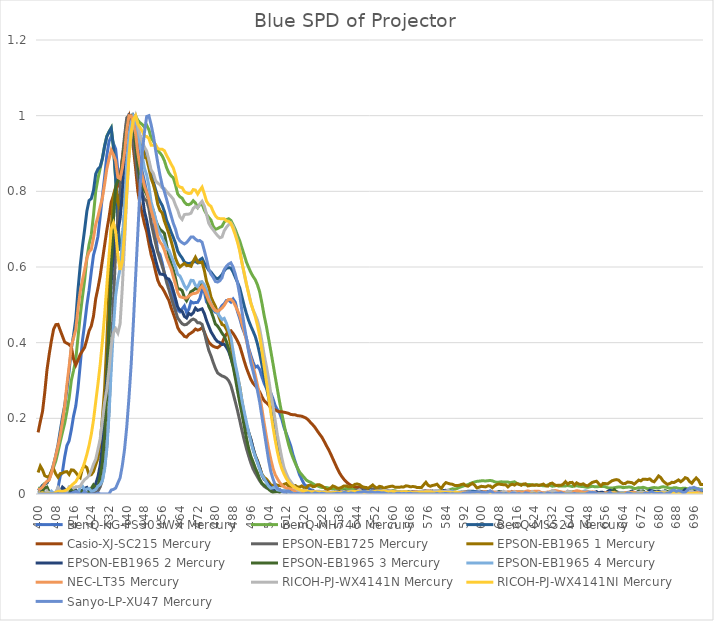
| Category | BenQ-KG-PS303WX | BenQ-MH740 | BenQ-MS524 | Casio-XJ-SC215 | EPSON-EB1725 | EPSON-EB1965 1 | EPSON-EB1965 2 | EPSON-EB1965 3 | EPSON-EB1965 4 | NEC-LT35 | RICOH-PJ-WX4141N | RICOH-PJ-WX4141NI | Sanyo-LP-XU47 |
|---|---|---|---|---|---|---|---|---|---|---|---|---|---|
| 400.0 | 0 | 0.015 | 0.009 | 0.163 | 0 | 0.057 | 0.003 | 0 | 0.005 | 0.011 | 0.004 | 0.003 | 0 |
| 401.0 | 0 | 0.015 | 0.014 | 0.192 | 0 | 0.074 | 0.006 | 0 | 0 | 0.014 | 0 | 0.002 | 0 |
| 402.0 | 0 | 0.022 | 0.023 | 0.218 | 0 | 0.064 | 0.003 | 0.008 | 0 | 0.018 | 0 | 0.003 | 0 |
| 403.0 | 0 | 0.028 | 0.026 | 0.268 | 0 | 0.048 | 0.003 | 0.016 | 0 | 0.027 | 0.001 | 0.001 | 0 |
| 404.0 | 0 | 0.03 | 0.03 | 0.328 | 0 | 0.046 | 0.001 | 0.018 | 0 | 0.034 | 0.008 | 0.002 | 0 |
| 405.0 | 0 | 0.04 | 0.04 | 0.369 | 0 | 0.046 | 0 | 0.006 | 0.002 | 0.037 | 0 | 0.002 | 0 |
| 406.0 | 0 | 0.058 | 0.059 | 0.405 | 0 | 0.06 | 0.004 | 0 | 0.008 | 0.055 | 0 | 0 | 0 |
| 407.0 | 0 | 0.071 | 0.079 | 0.436 | 0 | 0.066 | 0.002 | 0 | 0.001 | 0.078 | 0 | 0.001 | 0 |
| 408.0 | 0 | 0.088 | 0.102 | 0.448 | 0 | 0.053 | 0.002 | 0 | 0.005 | 0.102 | 0.005 | 0.004 | 0 |
| 409.0 | 0.017 | 0.112 | 0.131 | 0.448 | 0.001 | 0.044 | 0 | 0.001 | 0.003 | 0.127 | 0.017 | 0.007 | 0.001 |
| 410.0 | 0.047 | 0.138 | 0.167 | 0.432 | 0.001 | 0.054 | 0.006 | 0.007 | 0 | 0.156 | 0.008 | 0.007 | 0 |
| 411.0 | 0.059 | 0.164 | 0.203 | 0.417 | 0 | 0.055 | 0.018 | 0 | 0 | 0.191 | 0 | 0.007 | 0 |
| 412.0 | 0.098 | 0.187 | 0.234 | 0.402 | 0.001 | 0.058 | 0.013 | 0 | 0 | 0.233 | 0 | 0.008 | 0 |
| 413.0 | 0.128 | 0.218 | 0.277 | 0.399 | 0 | 0.059 | 0 | 0.001 | 0 | 0.289 | 0.007 | 0.011 | 0 |
| 414.0 | 0.141 | 0.254 | 0.326 | 0.395 | 0 | 0.052 | 0.002 | 0.011 | 0 | 0.338 | 0.019 | 0.016 | 0 |
| 415.0 | 0.17 | 0.3 | 0.384 | 0.389 | 0 | 0.064 | 0.012 | 0.012 | 0 | 0.391 | 0.02 | 0.022 | 0 |
| 416.0 | 0.206 | 0.326 | 0.42 | 0.357 | 0 | 0.063 | 0.007 | 0.011 | 0 | 0.412 | 0.015 | 0.028 | 0.005 |
| 417.0 | 0.232 | 0.356 | 0.463 | 0.341 | 0 | 0.057 | 0.011 | 0.008 | 0.002 | 0.435 | 0.019 | 0.033 | 0.007 |
| 418.0 | 0.279 | 0.414 | 0.54 | 0.354 | 0 | 0.049 | 0.004 | 0.003 | 0 | 0.49 | 0.019 | 0.043 | 0.004 |
| 419.0 | 0.341 | 0.472 | 0.603 | 0.369 | 0 | 0.043 | 0 | 0.009 | 0.019 | 0.535 | 0.02 | 0.056 | 0 |
| 420.0 | 0.405 | 0.52 | 0.654 | 0.378 | 0 | 0.067 | 0.01 | 0.006 | 0.021 | 0.565 | 0.03 | 0.067 | 0 |
| 421.0 | 0.449 | 0.566 | 0.699 | 0.388 | 0 | 0.075 | 0.015 | 0.003 | 0.011 | 0.593 | 0.038 | 0.084 | 0.007 |
| 422.0 | 0.499 | 0.622 | 0.747 | 0.408 | 0 | 0.07 | 0.017 | 0.003 | 0.013 | 0.624 | 0.042 | 0.105 | 0 |
| 423.0 | 0.539 | 0.659 | 0.776 | 0.431 | 0.001 | 0.049 | 0.008 | 0.002 | 0.015 | 0.64 | 0.049 | 0.128 | 0 |
| 424.0 | 0.588 | 0.685 | 0.781 | 0.444 | 0.001 | 0.051 | 0.009 | 0.015 | 0.007 | 0.646 | 0.062 | 0.158 | 0 |
| 425.0 | 0.632 | 0.738 | 0.802 | 0.47 | 0.003 | 0.059 | 0.015 | 0.024 | 0.009 | 0.677 | 0.079 | 0.195 | 0 |
| 426.0 | 0.653 | 0.801 | 0.846 | 0.516 | 0.004 | 0.077 | 0.027 | 0.017 | 0.012 | 0.713 | 0.092 | 0.244 | 0 |
| 427.0 | 0.681 | 0.833 | 0.859 | 0.544 | 0.008 | 0.094 | 0.045 | 0.019 | 0.02 | 0.733 | 0.118 | 0.291 | 0.002 |
| 428.0 | 0.733 | 0.861 | 0.865 | 0.576 | 0.018 | 0.134 | 0.075 | 0.047 | 0.025 | 0.759 | 0.145 | 0.342 | 0 |
| 429.0 | 0.787 | 0.887 | 0.886 | 0.617 | 0.037 | 0.201 | 0.127 | 0.082 | 0.035 | 0.782 | 0.193 | 0.403 | 0 |
| 430.0 | 0.837 | 0.92 | 0.919 | 0.657 | 0.071 | 0.277 | 0.197 | 0.15 | 0.064 | 0.818 | 0.241 | 0.472 | 0 |
| 431.0 | 0.895 | 0.946 | 0.945 | 0.697 | 0.127 | 0.402 | 0.31 | 0.268 | 0.118 | 0.859 | 0.276 | 0.55 | 0 |
| 432.0 | 0.932 | 0.958 | 0.957 | 0.731 | 0.221 | 0.546 | 0.438 | 0.425 | 0.208 | 0.886 | 0.33 | 0.629 | 0 |
| 433.0 | 0.945 | 0.968 | 0.967 | 0.771 | 0.362 | 0.698 | 0.561 | 0.6 | 0.329 | 0.909 | 0.393 | 0.701 | 0.01 |
| 434.0 | 0.926 | 0.914 | 0.919 | 0.789 | 0.509 | 0.789 | 0.636 | 0.726 | 0.44 | 0.897 | 0.426 | 0.716 | 0.012 |
| 435.0 | 0.912 | 0.832 | 0.833 | 0.808 | 0.642 | 0.812 | 0.688 | 0.812 | 0.524 | 0.881 | 0.437 | 0.694 | 0.016 |
| 436.0 | 0.854 | 0.715 | 0.709 | 0.814 | 0.734 | 0.772 | 0.695 | 0.829 | 0.565 | 0.837 | 0.425 | 0.63 | 0.029 |
| 437.0 | 0.835 | 0.65 | 0.643 | 0.834 | 0.809 | 0.751 | 0.728 | 0.836 | 0.595 | 0.833 | 0.45 | 0.592 | 0.043 |
| 438.0 | 0.883 | 0.665 | 0.667 | 0.883 | 0.887 | 0.779 | 0.797 | 0.872 | 0.667 | 0.862 | 0.546 | 0.617 | 0.075 |
| 439.0 | 0.918 | 0.729 | 0.742 | 0.934 | 0.945 | 0.845 | 0.87 | 0.918 | 0.766 | 0.902 | 0.664 | 0.69 | 0.117 |
| 440.0 | 0.968 | 0.819 | 0.843 | 0.987 | 0.994 | 0.925 | 0.952 | 0.966 | 0.875 | 0.963 | 0.788 | 0.795 | 0.177 |
| 441.0 | 0.995 | 0.903 | 0.928 | 1 | 1 | 0.98 | 1 | 0.997 | 0.949 | 1 | 0.892 | 0.891 | 0.254 |
| 442.0 | 1 | 0.964 | 0.98 | 0.965 | 0.967 | 0.999 | 0.995 | 1 | 0.983 | 1 | 0.953 | 0.956 | 0.343 |
| 443.0 | 0.993 | 0.99 | 1 | 0.914 | 0.927 | 1 | 0.964 | 0.969 | 1 | 0.979 | 0.983 | 0.99 | 0.454 |
| 444.0 | 0.962 | 1 | 0.99 | 0.861 | 0.886 | 0.987 | 0.925 | 0.926 | 0.993 | 0.952 | 1 | 1 | 0.573 |
| 445.0 | 0.919 | 0.988 | 0.961 | 0.801 | 0.837 | 0.955 | 0.876 | 0.873 | 0.952 | 0.902 | 0.976 | 0.979 | 0.69 |
| 446.0 | 0.88 | 0.981 | 0.945 | 0.766 | 0.812 | 0.946 | 0.832 | 0.835 | 0.923 | 0.866 | 0.949 | 0.969 | 0.808 |
| 447.0 | 0.851 | 0.977 | 0.923 | 0.74 | 0.795 | 0.927 | 0.792 | 0.819 | 0.894 | 0.84 | 0.931 | 0.96 | 0.902 |
| 448.0 | 0.826 | 0.969 | 0.905 | 0.714 | 0.779 | 0.89 | 0.746 | 0.803 | 0.861 | 0.814 | 0.917 | 0.946 | 0.956 |
| 449.0 | 0.798 | 0.975 | 0.899 | 0.693 | 0.775 | 0.887 | 0.723 | 0.791 | 0.843 | 0.797 | 0.906 | 0.945 | 0.998 |
| 450.0 | 0.78 | 0.963 | 0.877 | 0.662 | 0.754 | 0.861 | 0.691 | 0.778 | 0.814 | 0.778 | 0.883 | 0.94 | 1 |
| 451.0 | 0.757 | 0.941 | 0.847 | 0.633 | 0.717 | 0.834 | 0.661 | 0.764 | 0.772 | 0.75 | 0.857 | 0.922 | 0.976 |
| 452.0 | 0.734 | 0.933 | 0.825 | 0.614 | 0.69 | 0.818 | 0.644 | 0.749 | 0.75 | 0.73 | 0.848 | 0.922 | 0.947 |
| 453.0 | 0.683 | 0.921 | 0.805 | 0.588 | 0.663 | 0.796 | 0.618 | 0.724 | 0.729 | 0.708 | 0.828 | 0.924 | 0.91 |
| 454.0 | 0.641 | 0.908 | 0.786 | 0.565 | 0.638 | 0.765 | 0.597 | 0.71 | 0.703 | 0.68 | 0.822 | 0.913 | 0.875 |
| 455.0 | 0.633 | 0.902 | 0.773 | 0.552 | 0.62 | 0.749 | 0.581 | 0.7 | 0.687 | 0.666 | 0.818 | 0.911 | 0.843 |
| 456.0 | 0.611 | 0.894 | 0.763 | 0.545 | 0.602 | 0.743 | 0.581 | 0.695 | 0.677 | 0.658 | 0.809 | 0.911 | 0.816 |
| 457.0 | 0.583 | 0.881 | 0.746 | 0.535 | 0.584 | 0.721 | 0.579 | 0.689 | 0.665 | 0.644 | 0.807 | 0.907 | 0.799 |
| 458.0 | 0.566 | 0.862 | 0.723 | 0.523 | 0.559 | 0.705 | 0.57 | 0.657 | 0.649 | 0.625 | 0.799 | 0.895 | 0.779 |
| 459.0 | 0.557 | 0.849 | 0.709 | 0.512 | 0.541 | 0.688 | 0.568 | 0.632 | 0.645 | 0.61 | 0.793 | 0.884 | 0.756 |
| 460.0 | 0.547 | 0.841 | 0.693 | 0.493 | 0.52 | 0.669 | 0.557 | 0.609 | 0.63 | 0.596 | 0.787 | 0.872 | 0.736 |
| 461.0 | 0.52 | 0.836 | 0.678 | 0.477 | 0.501 | 0.648 | 0.538 | 0.593 | 0.615 | 0.574 | 0.779 | 0.862 | 0.716 |
| 462.0 | 0.487 | 0.817 | 0.663 | 0.46 | 0.483 | 0.624 | 0.516 | 0.57 | 0.599 | 0.554 | 0.764 | 0.843 | 0.7 |
| 463.0 | 0.486 | 0.793 | 0.642 | 0.44 | 0.465 | 0.609 | 0.494 | 0.542 | 0.581 | 0.532 | 0.75 | 0.816 | 0.678 |
| 464.0 | 0.482 | 0.785 | 0.632 | 0.43 | 0.457 | 0.6 | 0.486 | 0.542 | 0.576 | 0.521 | 0.733 | 0.811 | 0.669 |
| 465.0 | 0.489 | 0.782 | 0.624 | 0.424 | 0.45 | 0.605 | 0.483 | 0.538 | 0.564 | 0.52 | 0.726 | 0.81 | 0.664 |
| 466.0 | 0.497 | 0.772 | 0.613 | 0.417 | 0.447 | 0.609 | 0.47 | 0.52 | 0.551 | 0.518 | 0.738 | 0.799 | 0.661 |
| 467.0 | 0.48 | 0.765 | 0.61 | 0.415 | 0.448 | 0.604 | 0.465 | 0.511 | 0.542 | 0.518 | 0.74 | 0.796 | 0.665 |
| 468.0 | 0.488 | 0.765 | 0.609 | 0.422 | 0.453 | 0.604 | 0.477 | 0.523 | 0.551 | 0.523 | 0.74 | 0.794 | 0.672 |
| 469.0 | 0.508 | 0.768 | 0.61 | 0.425 | 0.46 | 0.602 | 0.473 | 0.535 | 0.565 | 0.527 | 0.742 | 0.795 | 0.679 |
| 470.0 | 0.505 | 0.775 | 0.614 | 0.43 | 0.462 | 0.615 | 0.479 | 0.538 | 0.564 | 0.53 | 0.755 | 0.805 | 0.679 |
| 471.0 | 0.506 | 0.769 | 0.614 | 0.436 | 0.459 | 0.626 | 0.491 | 0.544 | 0.552 | 0.53 | 0.76 | 0.803 | 0.674 |
| 472.0 | 0.507 | 0.757 | 0.611 | 0.433 | 0.453 | 0.613 | 0.485 | 0.541 | 0.548 | 0.533 | 0.756 | 0.793 | 0.669 |
| 473.0 | 0.517 | 0.764 | 0.619 | 0.435 | 0.452 | 0.611 | 0.487 | 0.546 | 0.561 | 0.543 | 0.767 | 0.803 | 0.67 |
| 474.0 | 0.54 | 0.767 | 0.623 | 0.44 | 0.448 | 0.613 | 0.489 | 0.557 | 0.561 | 0.55 | 0.774 | 0.811 | 0.665 |
| 475.0 | 0.535 | 0.751 | 0.611 | 0.428 | 0.427 | 0.591 | 0.477 | 0.547 | 0.553 | 0.54 | 0.761 | 0.793 | 0.644 |
| 476.0 | 0.508 | 0.739 | 0.601 | 0.413 | 0.402 | 0.562 | 0.459 | 0.526 | 0.54 | 0.526 | 0.74 | 0.774 | 0.621 |
| 477.0 | 0.5 | 0.731 | 0.591 | 0.402 | 0.38 | 0.546 | 0.444 | 0.496 | 0.518 | 0.512 | 0.716 | 0.765 | 0.595 |
| 478.0 | 0.497 | 0.724 | 0.587 | 0.395 | 0.365 | 0.521 | 0.429 | 0.484 | 0.503 | 0.501 | 0.706 | 0.76 | 0.581 |
| 479.0 | 0.487 | 0.708 | 0.579 | 0.391 | 0.348 | 0.508 | 0.419 | 0.467 | 0.492 | 0.492 | 0.698 | 0.747 | 0.573 |
| 480.0 | 0.481 | 0.7 | 0.571 | 0.388 | 0.332 | 0.496 | 0.409 | 0.449 | 0.484 | 0.485 | 0.69 | 0.736 | 0.562 |
| 481.0 | 0.479 | 0.702 | 0.569 | 0.387 | 0.32 | 0.478 | 0.403 | 0.444 | 0.479 | 0.483 | 0.683 | 0.729 | 0.56 |
| 482.0 | 0.488 | 0.705 | 0.573 | 0.391 | 0.316 | 0.462 | 0.4 | 0.435 | 0.469 | 0.487 | 0.677 | 0.728 | 0.564 |
| 483.0 | 0.498 | 0.707 | 0.58 | 0.398 | 0.312 | 0.448 | 0.395 | 0.425 | 0.461 | 0.492 | 0.679 | 0.727 | 0.572 |
| 484.0 | 0.503 | 0.719 | 0.59 | 0.413 | 0.31 | 0.446 | 0.396 | 0.418 | 0.464 | 0.499 | 0.696 | 0.727 | 0.593 |
| 485.0 | 0.512 | 0.725 | 0.596 | 0.423 | 0.306 | 0.435 | 0.388 | 0.402 | 0.451 | 0.509 | 0.705 | 0.722 | 0.602 |
| 486.0 | 0.512 | 0.728 | 0.598 | 0.429 | 0.3 | 0.42 | 0.377 | 0.384 | 0.433 | 0.514 | 0.712 | 0.721 | 0.608 |
| 487.0 | 0.507 | 0.723 | 0.597 | 0.432 | 0.287 | 0.392 | 0.359 | 0.361 | 0.414 | 0.514 | 0.717 | 0.715 | 0.611 |
| 488.0 | 0.515 | 0.712 | 0.587 | 0.424 | 0.266 | 0.363 | 0.34 | 0.336 | 0.378 | 0.509 | 0.708 | 0.701 | 0.6 |
| 489.0 | 0.507 | 0.699 | 0.573 | 0.415 | 0.243 | 0.335 | 0.32 | 0.307 | 0.343 | 0.497 | 0.689 | 0.684 | 0.581 |
| 490.0 | 0.481 | 0.683 | 0.559 | 0.404 | 0.22 | 0.309 | 0.296 | 0.273 | 0.315 | 0.485 | 0.669 | 0.665 | 0.557 |
| 491.0 | 0.464 | 0.669 | 0.545 | 0.391 | 0.194 | 0.284 | 0.271 | 0.241 | 0.283 | 0.471 | 0.646 | 0.642 | 0.525 |
| 492.0 | 0.442 | 0.65 | 0.521 | 0.372 | 0.168 | 0.245 | 0.239 | 0.212 | 0.247 | 0.45 | 0.612 | 0.611 | 0.483 |
| 493.0 | 0.427 | 0.632 | 0.498 | 0.352 | 0.143 | 0.212 | 0.211 | 0.18 | 0.218 | 0.43 | 0.582 | 0.585 | 0.446 |
| 494.0 | 0.412 | 0.613 | 0.477 | 0.333 | 0.121 | 0.183 | 0.181 | 0.149 | 0.19 | 0.406 | 0.554 | 0.556 | 0.412 |
| 495.0 | 0.385 | 0.599 | 0.459 | 0.318 | 0.101 | 0.163 | 0.163 | 0.121 | 0.165 | 0.38 | 0.532 | 0.528 | 0.376 |
| 496.0 | 0.367 | 0.586 | 0.444 | 0.303 | 0.082 | 0.144 | 0.145 | 0.099 | 0.138 | 0.358 | 0.506 | 0.504 | 0.347 |
| 497.0 | 0.348 | 0.575 | 0.43 | 0.293 | 0.066 | 0.12 | 0.122 | 0.085 | 0.116 | 0.338 | 0.487 | 0.487 | 0.325 |
| 498.0 | 0.335 | 0.566 | 0.416 | 0.286 | 0.055 | 0.102 | 0.101 | 0.069 | 0.099 | 0.314 | 0.474 | 0.469 | 0.301 |
| 499.0 | 0.338 | 0.553 | 0.396 | 0.279 | 0.045 | 0.088 | 0.086 | 0.056 | 0.082 | 0.288 | 0.459 | 0.446 | 0.273 |
| 500.0 | 0.329 | 0.534 | 0.371 | 0.27 | 0.035 | 0.071 | 0.07 | 0.039 | 0.065 | 0.26 | 0.436 | 0.417 | 0.243 |
| 501.0 | 0.31 | 0.505 | 0.341 | 0.257 | 0.026 | 0.052 | 0.05 | 0.028 | 0.051 | 0.225 | 0.404 | 0.378 | 0.204 |
| 502.0 | 0.293 | 0.472 | 0.312 | 0.247 | 0.02 | 0.044 | 0.039 | 0.023 | 0.041 | 0.188 | 0.368 | 0.337 | 0.166 |
| 503.0 | 0.28 | 0.444 | 0.284 | 0.241 | 0.016 | 0.04 | 0.034 | 0.018 | 0.031 | 0.153 | 0.339 | 0.299 | 0.128 |
| 504.0 | 0.272 | 0.411 | 0.255 | 0.235 | 0.014 | 0.032 | 0.025 | 0.013 | 0.021 | 0.119 | 0.305 | 0.257 | 0.09 |
| 505.0 | 0.267 | 0.378 | 0.224 | 0.229 | 0.012 | 0.024 | 0.018 | 0.008 | 0.015 | 0.092 | 0.266 | 0.216 | 0.06 |
| 506.0 | 0.251 | 0.344 | 0.192 | 0.225 | 0.009 | 0.023 | 0.014 | 0.004 | 0.016 | 0.068 | 0.232 | 0.178 | 0.04 |
| 507.0 | 0.233 | 0.31 | 0.16 | 0.222 | 0.008 | 0.026 | 0.012 | 0.006 | 0.018 | 0.051 | 0.194 | 0.142 | 0.024 |
| 508.0 | 0.223 | 0.276 | 0.13 | 0.219 | 0.007 | 0.023 | 0.013 | 0.007 | 0.011 | 0.04 | 0.155 | 0.111 | 0.015 |
| 509.0 | 0.213 | 0.242 | 0.103 | 0.217 | 0.007 | 0.022 | 0.011 | 0.004 | 0.01 | 0.03 | 0.125 | 0.085 | 0.012 |
| 510.0 | 0.197 | 0.212 | 0.08 | 0.217 | 0.007 | 0.022 | 0.006 | 0.008 | 0.009 | 0.024 | 0.095 | 0.067 | 0.007 |
| 511.0 | 0.176 | 0.183 | 0.061 | 0.216 | 0.006 | 0.026 | 0.006 | 0.008 | 0.01 | 0.019 | 0.069 | 0.053 | 0.005 |
| 512.0 | 0.16 | 0.155 | 0.047 | 0.215 | 0.007 | 0.028 | 0.005 | 0.007 | 0.011 | 0.016 | 0.054 | 0.041 | 0.007 |
| 513.0 | 0.144 | 0.132 | 0.035 | 0.213 | 0.007 | 0.021 | 0.004 | 0.009 | 0.004 | 0.014 | 0.041 | 0.032 | 0.008 |
| 514.0 | 0.127 | 0.112 | 0.029 | 0.21 | 0.006 | 0.019 | 0.006 | 0.008 | 0.002 | 0.013 | 0.033 | 0.025 | 0.004 |
| 515.0 | 0.104 | 0.096 | 0.023 | 0.21 | 0.006 | 0.022 | 0.006 | 0.002 | 0.005 | 0.011 | 0.024 | 0.02 | 0 |
| 516.0 | 0.086 | 0.082 | 0.017 | 0.209 | 0.006 | 0.023 | 0.005 | 0.001 | 0.004 | 0.008 | 0.017 | 0.017 | 0 |
| 517.0 | 0.069 | 0.069 | 0.014 | 0.207 | 0.006 | 0.019 | 0.004 | 0.004 | 0.005 | 0.008 | 0.011 | 0.014 | 0.002 |
| 518.0 | 0.051 | 0.058 | 0.01 | 0.206 | 0.005 | 0.018 | 0.004 | 0.003 | 0.002 | 0.007 | 0.007 | 0.012 | 0 |
| 519.0 | 0.039 | 0.051 | 0.009 | 0.206 | 0.005 | 0.021 | 0.005 | 0.001 | 0 | 0.006 | 0.009 | 0.009 | 0 |
| 520.0 | 0.026 | 0.044 | 0.007 | 0.203 | 0.006 | 0.017 | 0.004 | 0.001 | 0.002 | 0.007 | 0.01 | 0.008 | 0 |
| 521.0 | 0.021 | 0.037 | 0.004 | 0.2 | 0.007 | 0.016 | 0.003 | 0.003 | 0.005 | 0.006 | 0.007 | 0.008 | 0.002 |
| 522.0 | 0.015 | 0.033 | 0.004 | 0.195 | 0.006 | 0.023 | 0.006 | 0.002 | 0.004 | 0.006 | 0.006 | 0.007 | 0.003 |
| 523.0 | 0.011 | 0.031 | 0.004 | 0.189 | 0.006 | 0.023 | 0.008 | 0.006 | 0.002 | 0.007 | 0.007 | 0.005 | 0 |
| 524.0 | 0.01 | 0.027 | 0.003 | 0.183 | 0.005 | 0.02 | 0.004 | 0.007 | 0.003 | 0.007 | 0.005 | 0.005 | 0 |
| 525.0 | 0.005 | 0.024 | 0.003 | 0.176 | 0.005 | 0.02 | 0.003 | 0.001 | 0.003 | 0.005 | 0.006 | 0.006 | 0.003 |
| 526.0 | 0.001 | 0.022 | 0.002 | 0.167 | 0.005 | 0.025 | 0.004 | 0.002 | 0.002 | 0.004 | 0.007 | 0.005 | 0.001 |
| 527.0 | 0 | 0.019 | 0.002 | 0.158 | 0.004 | 0.024 | 0.004 | 0.002 | 0.002 | 0.004 | 0.007 | 0.004 | 0.001 |
| 528.0 | 0 | 0.017 | 0.001 | 0.151 | 0.003 | 0.021 | 0.003 | 0 | 0.005 | 0.004 | 0.005 | 0.005 | 0.002 |
| 529.0 | 0 | 0.017 | 0.001 | 0.14 | 0.004 | 0.018 | 0.001 | 0.003 | 0.003 | 0.004 | 0.007 | 0.005 | 0.001 |
| 530.0 | 0 | 0.017 | 0.001 | 0.129 | 0.004 | 0.012 | 0 | 0.003 | 0 | 0.005 | 0.005 | 0.004 | 0 |
| 531.0 | 0 | 0.016 | 0.001 | 0.118 | 0.004 | 0.012 | 0 | 0 | 0.001 | 0.005 | 0 | 0.003 | 0 |
| 532.0 | 0 | 0.015 | 0.001 | 0.106 | 0.004 | 0.016 | 0 | 0.003 | 0.003 | 0.004 | 0.002 | 0.003 | 0 |
| 533.0 | 0 | 0.014 | 0.002 | 0.093 | 0.004 | 0.021 | 0.003 | 0.004 | 0.003 | 0.004 | 0.005 | 0.004 | 0 |
| 534.0 | 0 | 0.014 | 0.001 | 0.08 | 0.005 | 0.019 | 0.002 | 0.003 | 0 | 0.003 | 0.004 | 0.004 | 0.001 |
| 535.0 | 0 | 0.015 | 0.002 | 0.068 | 0.006 | 0.015 | 0 | 0.004 | 0.001 | 0.003 | 0.003 | 0.004 | 0.002 |
| 536.0 | 0 | 0.014 | 0.002 | 0.056 | 0.005 | 0.016 | 0 | 0.006 | 0.003 | 0.005 | 0 | 0.003 | 0.001 |
| 537.0 | 0 | 0.013 | 0.002 | 0.047 | 0.006 | 0.018 | 0.001 | 0.005 | 0.006 | 0.005 | 0.003 | 0.003 | 0.001 |
| 538.0 | 0 | 0.014 | 0.002 | 0.039 | 0.007 | 0.021 | 0.007 | 0.002 | 0.005 | 0.003 | 0.006 | 0.004 | 0.004 |
| 539.0 | 0 | 0.015 | 0.003 | 0.033 | 0.005 | 0.021 | 0.007 | 0.003 | 0.001 | 0.003 | 0.005 | 0.005 | 0.003 |
| 540.0 | 0 | 0.015 | 0.004 | 0.027 | 0.006 | 0.019 | 0.002 | 0.001 | 0 | 0.005 | 0.006 | 0.004 | 0.001 |
| 541.0 | 0 | 0.013 | 0.001 | 0.024 | 0.007 | 0.019 | 0.003 | 0.003 | 0.003 | 0.004 | 0.007 | 0.005 | 0.003 |
| 542.0 | 0 | 0.012 | 0 | 0.021 | 0.006 | 0.021 | 0.004 | 0.007 | 0.005 | 0.003 | 0.007 | 0.007 | 0.002 |
| 543.0 | 0 | 0.014 | 0.002 | 0.018 | 0.007 | 0.026 | 0.006 | 0.005 | 0.004 | 0.003 | 0.004 | 0.007 | 0 |
| 544.0 | 0 | 0.014 | 0.002 | 0.018 | 0.01 | 0.026 | 0.004 | 0.006 | 0.004 | 0.003 | 0.007 | 0.007 | 0.004 |
| 545.0 | 0 | 0.012 | 0.001 | 0.018 | 0.012 | 0.025 | 0.005 | 0.007 | 0.004 | 0.003 | 0.011 | 0.006 | 0.005 |
| 546.0 | 0 | 0.011 | 0.001 | 0.017 | 0.011 | 0.02 | 0.008 | 0.001 | 0.001 | 0.004 | 0.007 | 0.005 | 0.005 |
| 547.0 | 0 | 0.009 | 0 | 0.016 | 0.012 | 0.018 | 0.007 | 0.003 | 0.001 | 0.004 | 0.006 | 0.005 | 0.007 |
| 548.0 | 0 | 0.009 | 0 | 0.015 | 0.013 | 0.017 | 0.005 | 0.004 | 0.001 | 0.005 | 0.007 | 0.005 | 0.006 |
| 549.0 | 0 | 0.01 | 0.001 | 0.013 | 0.013 | 0.015 | 0.005 | 0.004 | 0.004 | 0.006 | 0.005 | 0.006 | 0.004 |
| 550.0 | 0 | 0.01 | 0.002 | 0.012 | 0.014 | 0.02 | 0.01 | 0.006 | 0.009 | 0.006 | 0.006 | 0.006 | 0.006 |
| 551.0 | 0 | 0.01 | 0.001 | 0.012 | 0.014 | 0.024 | 0.008 | 0.004 | 0.006 | 0.004 | 0.008 | 0.006 | 0.005 |
| 552.0 | 0 | 0.011 | 0.003 | 0.011 | 0.014 | 0.019 | 0.004 | 0.002 | 0.005 | 0.004 | 0.007 | 0.007 | 0.003 |
| 553.0 | 0 | 0.01 | 0.002 | 0.009 | 0.013 | 0.016 | 0.004 | 0.005 | 0.006 | 0.005 | 0.008 | 0.007 | 0.005 |
| 554.0 | 0 | 0.01 | 0.001 | 0.008 | 0.012 | 0.02 | 0.005 | 0.004 | 0.004 | 0.005 | 0.008 | 0.007 | 0.004 |
| 555.0 | 0 | 0.011 | 0.001 | 0.007 | 0.011 | 0.019 | 0.006 | 0.002 | 0.003 | 0.005 | 0.008 | 0.007 | 0.003 |
| 556.0 | 0 | 0.01 | 0.002 | 0.007 | 0.012 | 0.015 | 0.005 | 0.001 | 0.001 | 0.004 | 0.009 | 0.008 | 0.003 |
| 557.0 | 0 | 0.009 | 0.001 | 0.007 | 0.011 | 0.018 | 0.006 | 0.001 | 0 | 0.003 | 0.009 | 0.007 | 0.001 |
| 558.0 | 0 | 0.008 | 0.001 | 0.005 | 0.009 | 0.019 | 0.003 | 0.003 | 0.001 | 0.003 | 0.008 | 0.005 | 0 |
| 559.0 | 0 | 0.008 | 0.002 | 0.005 | 0.008 | 0.02 | 0.003 | 0.006 | 0.007 | 0.004 | 0.009 | 0.006 | 0.001 |
| 560.0 | 0 | 0.008 | 0.002 | 0.005 | 0.008 | 0.021 | 0.004 | 0.006 | 0.007 | 0.005 | 0.007 | 0.007 | 0 |
| 561.0 | 0 | 0.008 | 0.002 | 0.004 | 0.006 | 0.018 | 0.002 | 0.002 | 0.001 | 0.006 | 0.004 | 0.006 | 0 |
| 562.0 | 0 | 0.007 | 0.002 | 0.003 | 0.005 | 0.018 | 0 | 0.002 | 0 | 0.005 | 0.006 | 0.005 | 0.002 |
| 563.0 | 0 | 0.005 | 0.001 | 0.003 | 0.006 | 0.018 | 0 | 0.004 | 0 | 0.003 | 0.006 | 0.006 | 0.002 |
| 564.0 | 0 | 0.006 | 0 | 0.004 | 0.006 | 0.019 | 0.004 | 0.004 | 0.001 | 0.004 | 0.006 | 0.005 | 0.001 |
| 565.0 | 0 | 0.007 | 0.001 | 0.004 | 0.007 | 0.019 | 0.005 | 0.002 | 0.003 | 0.003 | 0.006 | 0.006 | 0.001 |
| 566.0 | 0 | 0.006 | 0.001 | 0.004 | 0.006 | 0.022 | 0.004 | 0.003 | 0.006 | 0.003 | 0.006 | 0.006 | 0.001 |
| 567.0 | 0 | 0.005 | 0.001 | 0.004 | 0.005 | 0.021 | 0.003 | 0.006 | 0.004 | 0.004 | 0.004 | 0.005 | 0.001 |
| 568.0 | 0 | 0.004 | 0.001 | 0.003 | 0.005 | 0.019 | 0.004 | 0.003 | 0.002 | 0.004 | 0 | 0.005 | 0.002 |
| 569.0 | 0 | 0.004 | 0.001 | 0.003 | 0.006 | 0.02 | 0.005 | 0.004 | 0 | 0.005 | 0 | 0.004 | 0.001 |
| 570.0 | 0 | 0.005 | 0.002 | 0.003 | 0.005 | 0.019 | 0.004 | 0.004 | 0 | 0.005 | 0.003 | 0.003 | 0 |
| 571.0 | 0 | 0.005 | 0.001 | 0.004 | 0.005 | 0.017 | 0.004 | 0.004 | 0.003 | 0.006 | 0.004 | 0.003 | 0.001 |
| 572.0 | 0 | 0.005 | 0 | 0.004 | 0.006 | 0.017 | 0.003 | 0.003 | 0.002 | 0.006 | 0.007 | 0.005 | 0 |
| 573.0 | 0 | 0.005 | 0 | 0.004 | 0.007 | 0.017 | 0.002 | 0 | 0.002 | 0.006 | 0.008 | 0.004 | 0 |
| 574.0 | 0 | 0.006 | 0.001 | 0.005 | 0.008 | 0.024 | 0.007 | 0 | 0.003 | 0.006 | 0.006 | 0.004 | 0 |
| 575.0 | 0 | 0.006 | 0.002 | 0.005 | 0.008 | 0.031 | 0.008 | 0 | 0.005 | 0.007 | 0.007 | 0.005 | 0 |
| 576.0 | 0 | 0.005 | 0.002 | 0.005 | 0.006 | 0.023 | 0.007 | 0.004 | 0.005 | 0.009 | 0.008 | 0.006 | 0 |
| 577.0 | 0 | 0.006 | 0.001 | 0.005 | 0.007 | 0.02 | 0.008 | 0.007 | 0.004 | 0.008 | 0.007 | 0.005 | 0 |
| 578.0 | 0 | 0.005 | 0.001 | 0.005 | 0.008 | 0.023 | 0.007 | 0.006 | 0.005 | 0.005 | 0.005 | 0.004 | 0 |
| 579.0 | 0 | 0.007 | 0.002 | 0.005 | 0.007 | 0.024 | 0.005 | 0.002 | 0.006 | 0.005 | 0.008 | 0.003 | 0 |
| 580.0 | 0 | 0.008 | 0.002 | 0.004 | 0.007 | 0.026 | 0.005 | 0.004 | 0.003 | 0.005 | 0.009 | 0.004 | 0.001 |
| 581.0 | 0 | 0.008 | 0.002 | 0.005 | 0.007 | 0.019 | 0.003 | 0.006 | 0.004 | 0.004 | 0.007 | 0.006 | 0 |
| 582.0 | 0 | 0.008 | 0.002 | 0.004 | 0.007 | 0.015 | 0.002 | 0.006 | 0.001 | 0.003 | 0.006 | 0.005 | 0 |
| 583.0 | 0 | 0.007 | 0.002 | 0.005 | 0.006 | 0.024 | 0.009 | 0.004 | 0 | 0.004 | 0.007 | 0.004 | 0.001 |
| 584.0 | 0 | 0.009 | 0.003 | 0.003 | 0.006 | 0.03 | 0.01 | 0.001 | 0.002 | 0.004 | 0.008 | 0.004 | 0.001 |
| 585.0 | 0 | 0.01 | 0.003 | 0.002 | 0.006 | 0.028 | 0.009 | 0.003 | 0.003 | 0.003 | 0.01 | 0.004 | 0.001 |
| 586.0 | 0 | 0.012 | 0.002 | 0.004 | 0.005 | 0.026 | 0.007 | 0.006 | 0.005 | 0.003 | 0.006 | 0.004 | 0 |
| 587.0 | 0 | 0.014 | 0.003 | 0.004 | 0.005 | 0.026 | 0.003 | 0.006 | 0.008 | 0.004 | 0.003 | 0.003 | 0.001 |
| 588.0 | 0 | 0.013 | 0.003 | 0.004 | 0.004 | 0.023 | 0.003 | 0.003 | 0.003 | 0.002 | 0.005 | 0.004 | 0 |
| 589.0 | 0 | 0.014 | 0.003 | 0.004 | 0.004 | 0.022 | 0.004 | 0.001 | 0.003 | 0.003 | 0.003 | 0.004 | 0 |
| 590.0 | 0 | 0.017 | 0.004 | 0.003 | 0.003 | 0.023 | 0.003 | 0.003 | 0.005 | 0.004 | 0.001 | 0.003 | 0 |
| 591.0 | 0 | 0.019 | 0.004 | 0.002 | 0.003 | 0.025 | 0 | 0.005 | 0.005 | 0.004 | 0.002 | 0.002 | 0 |
| 592.0 | 0 | 0.021 | 0.005 | 0.002 | 0.002 | 0.027 | 0.002 | 0.003 | 0.006 | 0.005 | 0.002 | 0.003 | 0.002 |
| 593.0 | 0 | 0.023 | 0.007 | 0.003 | 0.002 | 0.022 | 0.001 | 0.002 | 0.005 | 0.006 | 0.003 | 0.003 | 0.003 |
| 594.0 | 0 | 0.025 | 0.007 | 0.002 | 0.001 | 0.021 | 0 | 0 | 0 | 0.004 | 0.005 | 0.002 | 0.004 |
| 595.0 | 0 | 0.028 | 0.007 | 0.001 | 0.001 | 0.024 | 0.002 | 0.001 | 0 | 0.002 | 0.005 | 0.002 | 0.004 |
| 596.0 | 0 | 0.03 | 0.007 | 0.003 | 0.001 | 0.028 | 0.003 | 0.003 | 0.002 | 0.002 | 0.003 | 0.002 | 0.005 |
| 597.0 | 0 | 0.032 | 0.007 | 0.003 | 0.002 | 0.023 | 0 | 0.001 | 0 | 0.003 | 0.001 | 0.002 | 0.005 |
| 598.0 | 0 | 0.033 | 0.007 | 0.003 | 0.003 | 0.016 | 0 | 0 | 0.002 | 0.004 | 0.005 | 0.002 | 0.006 |
| 599.0 | 0 | 0.034 | 0.007 | 0.003 | 0.003 | 0.018 | 0 | 0.002 | 0.003 | 0.004 | 0.007 | 0.002 | 0.005 |
| 600.0 | 0 | 0.035 | 0.007 | 0.003 | 0.001 | 0.02 | 0 | 0.003 | 0.004 | 0.005 | 0.001 | 0.002 | 0.004 |
| 601.0 | 0 | 0.035 | 0.006 | 0.003 | 0 | 0.02 | 0.003 | 0.002 | 0.002 | 0.006 | 0.001 | 0.002 | 0.004 |
| 602.0 | 0 | 0.035 | 0.006 | 0.001 | 0 | 0.019 | 0.003 | 0 | 0 | 0.006 | 0.003 | 0.002 | 0.003 |
| 603.0 | 0 | 0.035 | 0.006 | 0.002 | 0 | 0.022 | 0.003 | 0 | 0 | 0.004 | 0.004 | 0.002 | 0.004 |
| 604.0 | 0 | 0.036 | 0.006 | 0.003 | 0 | 0.021 | 0.001 | 0 | 0 | 0.004 | 0.006 | 0.001 | 0.009 |
| 605.0 | 0 | 0.035 | 0.005 | 0.003 | 0 | 0.017 | 0 | 0 | 0.002 | 0.006 | 0.004 | 0.001 | 0.005 |
| 606.0 | 0 | 0.032 | 0.004 | 0.003 | 0 | 0.022 | 0 | 0 | 0.002 | 0.005 | 0.001 | 0 | 0 |
| 607.0 | 0 | 0.031 | 0.005 | 0.003 | 0 | 0.025 | 0 | 0.001 | 0.001 | 0.004 | 0.003 | 0 | 0.001 |
| 608.0 | 0 | 0.031 | 0.006 | 0.002 | 0.001 | 0.027 | 0 | 0.006 | 0.004 | 0.004 | 0.001 | 0 | 0.003 |
| 609.0 | 0 | 0.032 | 0.006 | 0.001 | 0.001 | 0.025 | 0 | 0.005 | 0.005 | 0.005 | 0.001 | 0.001 | 0.001 |
| 610.0 | 0 | 0.032 | 0.003 | 0.001 | 0 | 0.025 | 0.001 | 0.002 | 0.003 | 0.004 | 0.007 | 0.002 | 0 |
| 611.0 | 0 | 0.032 | 0.003 | 0.001 | 0 | 0.024 | 0 | 0.001 | 0 | 0.005 | 0.005 | 0.001 | 0.001 |
| 612.0 | 0 | 0.032 | 0.005 | 0.001 | 0 | 0.019 | 0 | 0.002 | 0 | 0.006 | 0 | 0.001 | 0 |
| 613.0 | 0 | 0.03 | 0.005 | 0 | 0 | 0.024 | 0 | 0 | 0 | 0.005 | 0.001 | 0.001 | 0 |
| 614.0 | 0 | 0.031 | 0.006 | 0 | 0 | 0.026 | 0.007 | 0 | 0 | 0.006 | 0.004 | 0.001 | 0.003 |
| 615.0 | 0 | 0.032 | 0.006 | 0.001 | 0 | 0.024 | 0.005 | 0.003 | 0 | 0.007 | 0.006 | 0.001 | 0.002 |
| 616.0 | 0 | 0.028 | 0.004 | 0.002 | 0.001 | 0.027 | 0.001 | 0.005 | 0.001 | 0.006 | 0.001 | 0.001 | 0 |
| 617.0 | 0 | 0.026 | 0.003 | 0.002 | 0 | 0.026 | 0 | 0.005 | 0 | 0.006 | 0 | 0.001 | 0.001 |
| 618.0 | 0 | 0.026 | 0.003 | 0.002 | 0 | 0.023 | 0 | 0.005 | 0 | 0.005 | 0 | 0.001 | 0 |
| 619.0 | 0 | 0.025 | 0.003 | 0.001 | 0 | 0.026 | 0 | 0.005 | 0.002 | 0.005 | 0.001 | 0.001 | 0 |
| 620.0 | 0 | 0.024 | 0.003 | 0.001 | 0 | 0.027 | 0.005 | 0.002 | 0.002 | 0.007 | 0.001 | 0 | 0.003 |
| 621.0 | 0 | 0.025 | 0.004 | 0.001 | 0 | 0.021 | 0.003 | 0.001 | 0.004 | 0.008 | 0 | 0 | 0.002 |
| 622.0 | 0 | 0.025 | 0.003 | 0.002 | 0 | 0.022 | 0.002 | 0 | 0.004 | 0.007 | 0 | 0.001 | 0 |
| 623.0 | 0 | 0.023 | 0.002 | 0.003 | 0 | 0.024 | 0.003 | 0 | 0.001 | 0.007 | 0.006 | 0.002 | 0 |
| 624.0 | 0 | 0.024 | 0.003 | 0.003 | 0.001 | 0.023 | 0.001 | 0 | 0.003 | 0.007 | 0.002 | 0.002 | 0.001 |
| 625.0 | 0 | 0.024 | 0.004 | 0.002 | 0.002 | 0.024 | 0.001 | 0.002 | 0.003 | 0.007 | 0 | 0.001 | 0 |
| 626.0 | 0 | 0.023 | 0.002 | 0.001 | 0 | 0.023 | 0.003 | 0.003 | 0.001 | 0.007 | 0.004 | 0.001 | 0.001 |
| 627.0 | 0 | 0.023 | 0.002 | 0.002 | 0 | 0.024 | 0.002 | 0.002 | 0 | 0.004 | 0.001 | 0 | 0.002 |
| 628.0 | 0 | 0.022 | 0.001 | 0.002 | 0.002 | 0.026 | 0 | 0 | 0.001 | 0.003 | 0 | 0 | 0 |
| 629.0 | 0 | 0.022 | 0.001 | 0.001 | 0.001 | 0.022 | 0 | 0 | 0.002 | 0.004 | 0.004 | 0.001 | 0 |
| 630.0 | 0 | 0.024 | 0.003 | 0.002 | 0 | 0.021 | 0 | 0 | 0.004 | 0.005 | 0.003 | 0 | 0.003 |
| 631.0 | 0 | 0.023 | 0.003 | 0.003 | 0 | 0.027 | 0.004 | 0.002 | 0.001 | 0.006 | 0.004 | 0 | 0.001 |
| 632.0 | 0 | 0.021 | 0 | 0.003 | 0.001 | 0.029 | 0.002 | 0.003 | 0 | 0.007 | 0.009 | 0.001 | 0 |
| 633.0 | 0 | 0.021 | 0.001 | 0.003 | 0 | 0.025 | 0 | 0.005 | 0.001 | 0.009 | 0.008 | 0 | 0.001 |
| 634.0 | 0 | 0.022 | 0.002 | 0.003 | 0.001 | 0.022 | 0 | 0.005 | 0 | 0.008 | 0.003 | 0.001 | 0.002 |
| 635.0 | 0 | 0.021 | 0.002 | 0.003 | 0.001 | 0.023 | 0.002 | 0.001 | 0 | 0.007 | 0 | 0.002 | 0.002 |
| 636.0 | 0 | 0.021 | 0.002 | 0.004 | 0 | 0.023 | 0 | 0 | 0.003 | 0.006 | 0.001 | 0.001 | 0.004 |
| 637.0 | 0 | 0.021 | 0.002 | 0.004 | 0 | 0.026 | 0 | 0 | 0.002 | 0.004 | 0 | 0.001 | 0.001 |
| 638.0 | 0 | 0.021 | 0.003 | 0.003 | 0 | 0.033 | 0 | 0 | 0 | 0.005 | 0.001 | 0.001 | 0 |
| 639.0 | 0 | 0.022 | 0.002 | 0.005 | 0 | 0.026 | 0 | 0.006 | 0 | 0.005 | 0.008 | 0.001 | 0 |
| 640.0 | 0 | 0.021 | 0.002 | 0.005 | 0.001 | 0.03 | 0 | 0.004 | 0.001 | 0.004 | 0.006 | 0 | 0 |
| 641.0 | 0 | 0.02 | 0.001 | 0.004 | 0 | 0.031 | 0 | 0.005 | 0 | 0.004 | 0.001 | 0 | 0 |
| 642.0 | 0 | 0.021 | 0 | 0.001 | 0.001 | 0.024 | 0 | 0.006 | 0 | 0.007 | 0.001 | 0 | 0.001 |
| 643.0 | 0 | 0.022 | 0 | 0 | 0.001 | 0.03 | 0.001 | 0.004 | 0 | 0.009 | 0.001 | 0 | 0 |
| 644.0 | 0 | 0.02 | 0 | 0 | 0 | 0.026 | 0 | 0.003 | 0 | 0.008 | 0 | 0 | 0 |
| 645.0 | 0 | 0.02 | 0.001 | 0.001 | 0.001 | 0.025 | 0 | 0.002 | 0.001 | 0.006 | 0.002 | 0.001 | 0 |
| 646.0 | 0 | 0.02 | 0.002 | 0.003 | 0.002 | 0.027 | 0 | 0.002 | 0.007 | 0.005 | 0 | 0.001 | 0 |
| 647.0 | 0 | 0.019 | 0.001 | 0.003 | 0.001 | 0.023 | 0 | 0.003 | 0.009 | 0.004 | 0 | 0 | 0 |
| 648.0 | 0 | 0.018 | 0 | 0.001 | 0 | 0.021 | 0 | 0.006 | 0.007 | 0.006 | 0 | 0.001 | 0.002 |
| 649.0 | 0 | 0.019 | 0.001 | 0.002 | 0 | 0.026 | 0 | 0.003 | 0.005 | 0.005 | 0.005 | 0.001 | 0.004 |
| 650.0 | 0 | 0.02 | 0.003 | 0.003 | 0.001 | 0.03 | 0 | 0.004 | 0 | 0.006 | 0 | 0.001 | 0.004 |
| 651.0 | 0 | 0.019 | 0.002 | 0.002 | 0.001 | 0.032 | 0.003 | 0.004 | 0 | 0.005 | 0 | 0.001 | 0.004 |
| 652.0 | 0 | 0.019 | 0 | 0.002 | 0 | 0.034 | 0.006 | 0 | 0 | 0.002 | 0.001 | 0 | 0.001 |
| 653.0 | 0 | 0.02 | 0 | 0.003 | 0 | 0.027 | 0.002 | 0 | 0 | 0.001 | 0 | 0 | 0 |
| 654.0 | 0 | 0.02 | 0.002 | 0.003 | 0 | 0.022 | 0.005 | 0 | 0 | 0 | 0 | 0 | 0 |
| 655.0 | 0 | 0.02 | 0.003 | 0.003 | 0 | 0.028 | 0.004 | 0 | 0 | 0.001 | 0.001 | 0 | 0.001 |
| 656.0 | 0 | 0.019 | 0.002 | 0.002 | 0 | 0.028 | 0 | 0 | 0.002 | 0.003 | 0 | 0.001 | 0 |
| 657.0 | 0 | 0.016 | 0.001 | 0.001 | 0 | 0.027 | 0.007 | 0.003 | 0 | 0.003 | 0 | 0.001 | 0 |
| 658.0 | 0 | 0.016 | 0.001 | 0.001 | 0 | 0.031 | 0.01 | 0.004 | 0 | 0.002 | 0.002 | 0.002 | 0.004 |
| 659.0 | 0 | 0.016 | 0.001 | 0.001 | 0 | 0.035 | 0.008 | 0.005 | 0 | 0.004 | 0.003 | 0.003 | 0 |
| 660.0 | 0 | 0.016 | 0.001 | 0 | 0 | 0.037 | 0.009 | 0.012 | 0 | 0.004 | 0 | 0.003 | 0 |
| 661.0 | 0 | 0.018 | 0.001 | 0 | 0 | 0.038 | 0.006 | 0.005 | 0.002 | 0.002 | 0 | 0.001 | 0 |
| 662.0 | 0 | 0.019 | 0 | 0.001 | 0 | 0.037 | 0.004 | 0 | 0.002 | 0.003 | 0 | 0.001 | 0.001 |
| 663.0 | 0 | 0.018 | 0 | 0.002 | 0 | 0.031 | 0.001 | 0 | 0.004 | 0.001 | 0 | 0.002 | 0 |
| 664.0 | 0 | 0.017 | 0 | 0.002 | 0 | 0.027 | 0.001 | 0 | 0.004 | 0 | 0.001 | 0.002 | 0 |
| 665.0 | 0 | 0.018 | 0 | 0.001 | 0 | 0.028 | 0.003 | 0 | 0 | 0.004 | 0 | 0.001 | 0 |
| 666.0 | 0 | 0.018 | 0.002 | 0.002 | 0 | 0.032 | 0.004 | 0 | 0 | 0.004 | 0 | 0.002 | 0.003 |
| 667.0 | 0 | 0.018 | 0.001 | 0.003 | 0 | 0.031 | 0.005 | 0 | 0.002 | 0.003 | 0 | 0.003 | 0.002 |
| 668.0 | 0 | 0.018 | 0 | 0.002 | 0 | 0.03 | 0.008 | 0.003 | 0 | 0.005 | 0 | 0.002 | 0 |
| 669.0 | 0 | 0.014 | 0 | 0.001 | 0 | 0.026 | 0.001 | 0.001 | 0 | 0.005 | 0 | 0.001 | 0 |
| 670.0 | 0 | 0.015 | 0.001 | 0 | 0 | 0.031 | 0.002 | 0.004 | 0.004 | 0.002 | 0 | 0 | 0 |
| 671.0 | 0 | 0.017 | 0.002 | 0.002 | 0 | 0.037 | 0.008 | 0.007 | 0.004 | 0.002 | 0.003 | 0 | 0 |
| 672.0 | 0 | 0.016 | 0.001 | 0.003 | 0 | 0.035 | 0.007 | 0.006 | 0.001 | 0.004 | 0.006 | 0.001 | 0 |
| 673.0 | 0 | 0.018 | 0.001 | 0.001 | 0.001 | 0.039 | 0.008 | 0.007 | 0 | 0.004 | 0.005 | 0.002 | 0 |
| 674.0 | 0 | 0.016 | 0 | 0 | 0.001 | 0.039 | 0.003 | 0.002 | 0.004 | 0.004 | 0.001 | 0.002 | 0.003 |
| 675.0 | 0 | 0.014 | 0 | 0.001 | 0.001 | 0.038 | 0.005 | 0 | 0.004 | 0.003 | 0 | 0.003 | 0.001 |
| 676.0 | 0 | 0.015 | 0.003 | 0.002 | 0.002 | 0.04 | 0.01 | 0 | 0 | 0.001 | 0 | 0.002 | 0.004 |
| 677.0 | 0 | 0.016 | 0 | 0.001 | 0.001 | 0.035 | 0.008 | 0.004 | 0 | 0.002 | 0.002 | 0.002 | 0.007 |
| 678.0 | 0 | 0.017 | 0 | 0.001 | 0.001 | 0.032 | 0.007 | 0.005 | 0 | 0.002 | 0.004 | 0.003 | 0.002 |
| 679.0 | 0 | 0.016 | 0.003 | 0.002 | 0.001 | 0.039 | 0.006 | 0.003 | 0.001 | 0.002 | 0.004 | 0.004 | 0.001 |
| 680.0 | 0 | 0.016 | 0.002 | 0.001 | 0.001 | 0.048 | 0.007 | 0 | 0 | 0.002 | 0.003 | 0.004 | 0.001 |
| 681.0 | 0 | 0.018 | 0.002 | 0.001 | 0 | 0.043 | 0.006 | 0 | 0.001 | 0.002 | 0.003 | 0.004 | 0.003 |
| 682.0 | 0 | 0.019 | 0.002 | 0.003 | 0 | 0.035 | 0 | 0.001 | 0.007 | 0.002 | 0.007 | 0.003 | 0 |
| 683.0 | 0 | 0.018 | 0 | 0.002 | 0 | 0.03 | 0 | 0.009 | 0.007 | 0.004 | 0.006 | 0.002 | 0 |
| 684.0 | 0 | 0.017 | 0 | 0.002 | 0.002 | 0.025 | 0 | 0.007 | 0 | 0.004 | 0.001 | 0.003 | 0.003 |
| 685.0 | 0 | 0.015 | 0 | 0.003 | 0.001 | 0.027 | 0 | 0.005 | 0 | 0.002 | 0.004 | 0.002 | 0.003 |
| 686.0 | 0 | 0.015 | 0 | 0.003 | 0 | 0.031 | 0 | 0.008 | 0 | 0.004 | 0.008 | 0.002 | 0.009 |
| 687.0 | 0 | 0.017 | 0 | 0.003 | 0 | 0.03 | 0 | 0.005 | 0.001 | 0.003 | 0.002 | 0.003 | 0.01 |
| 688.0 | 0 | 0.016 | 0 | 0.003 | 0.001 | 0.034 | 0.004 | 0.003 | 0 | 0.001 | 0 | 0.002 | 0.007 |
| 689.0 | 0 | 0.015 | 0 | 0.001 | 0.003 | 0.037 | 0.004 | 0.002 | 0 | 0 | 0 | 0.002 | 0.009 |
| 690.0 | 0 | 0.014 | 0 | 0 | 0.003 | 0.032 | 0 | 0 | 0 | 0 | 0.001 | 0.003 | 0.008 |
| 691.0 | 0 | 0.015 | 0 | 0.001 | 0.003 | 0.037 | 0.007 | 0 | 0 | 0 | 0.001 | 0.003 | 0.004 |
| 692.0 | 0 | 0.015 | 0 | 0.003 | 0.004 | 0.043 | 0.012 | 0 | 0.003 | 0.002 | 0.001 | 0.002 | 0.004 |
| 693.0 | 0 | 0.014 | 0 | 0.002 | 0.002 | 0.041 | 0.008 | 0 | 0.004 | 0.003 | 0.002 | 0.002 | 0.01 |
| 694.0 | 0 | 0.014 | 0 | 0.002 | 0.003 | 0.033 | 0.003 | 0 | 0.005 | 0.004 | 0.004 | 0.001 | 0.016 |
| 695.0 | 0 | 0.014 | 0 | 0.002 | 0.005 | 0.028 | 0.003 | 0 | 0.004 | 0.003 | 0.008 | 0.001 | 0.016 |
| 696.0 | 0 | 0.012 | 0 | 0 | 0.004 | 0.036 | 0.007 | 0 | 0.003 | 0.002 | 0.003 | 0.002 | 0.018 |
| 697.0 | 0 | 0.013 | 0 | 0.001 | 0.004 | 0.043 | 0.005 | 0 | 0.004 | 0.003 | 0 | 0.002 | 0.015 |
| 698.0 | 0 | 0.014 | 0 | 0.003 | 0.004 | 0.037 | 0.003 | 0.001 | 0 | 0.004 | 0.002 | 0 | 0.012 |
| 699.0 | 0 | 0.012 | 0 | 0.003 | 0.004 | 0.025 | 0.002 | 0.004 | 0 | 0.003 | 0 | 0 | 0.011 |
| 700.0 | 0 | 0.014 | 0 | 0.003 | 0.004 | 0.025 | 0.002 | 0.004 | 0 | 0 | 0 | 0 | 0.008 |